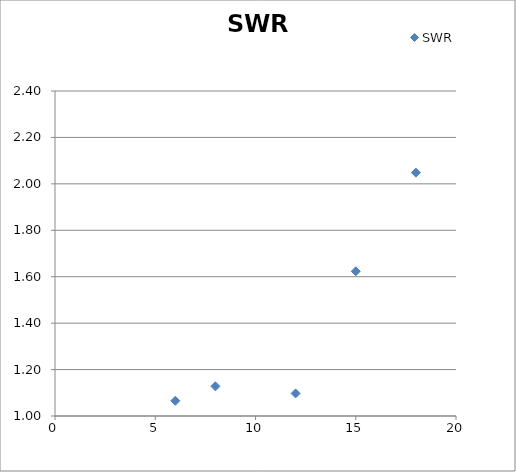
| Category | SWR |
|---|---|
| 6.0 | 1.066 |
| 8.0 | 1.128 |
| 12.0 | 1.097 |
| 15.0 | 1.623 |
| 18.0 | 2.048 |